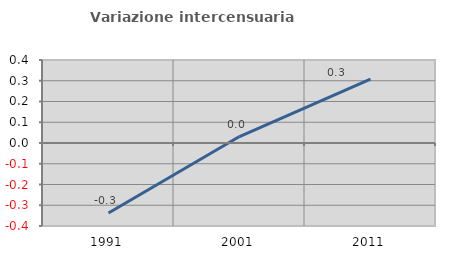
| Category | Variazione intercensuaria annua |
|---|---|
| 1991.0 | -0.337 |
| 2001.0 | 0.031 |
| 2011.0 | 0.307 |